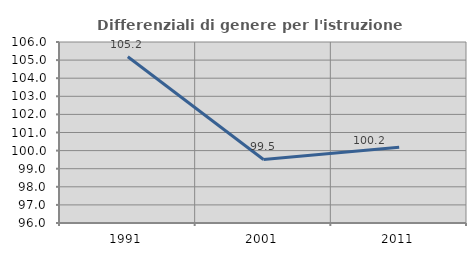
| Category | Differenziali di genere per l'istruzione superiore |
|---|---|
| 1991.0 | 105.184 |
| 2001.0 | 99.511 |
| 2011.0 | 100.18 |